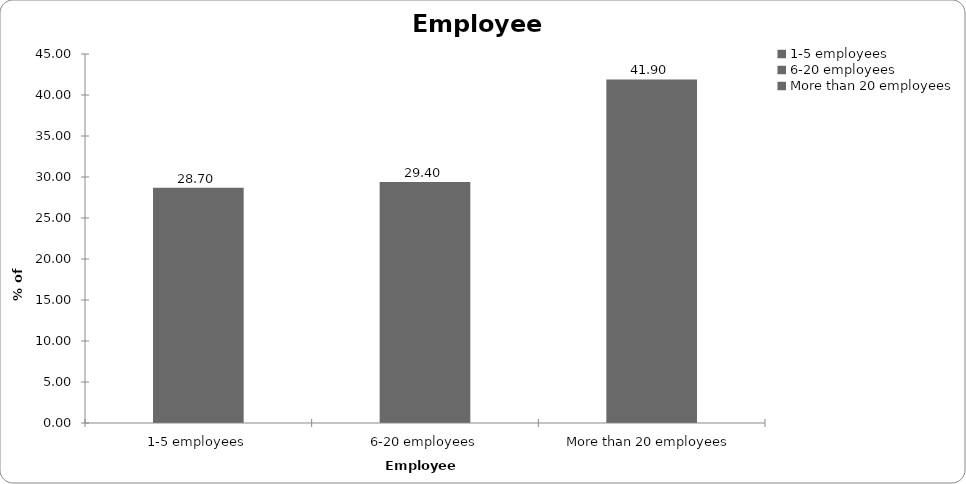
| Category | Employees |
|---|---|
| 1-5 employees | 28.7 |
| 6-20 employees | 29.4 |
| More than 20 employees | 41.9 |